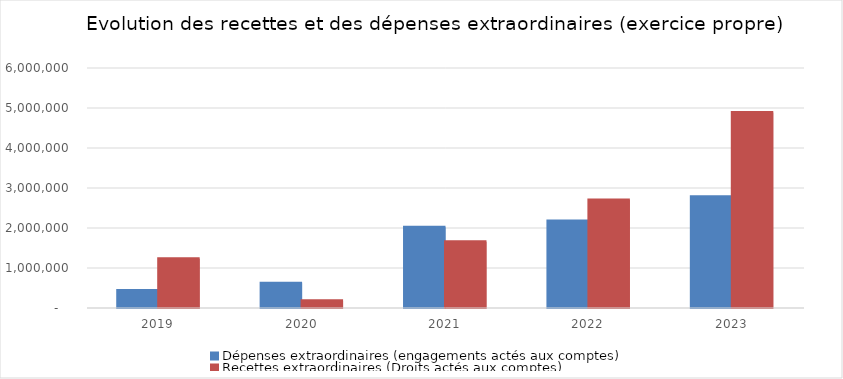
| Category | Dépenses extraordinaires (engagements actés aux comptes) | Recettes extraordinaires (Droits actés aux comptes) |
|---|---|---|
| 2019.0 | 435444.52 | 1230542.5 |
| 2020.0 | 619448.47 | 178625.62 |
| 2021.0 | 2021416.13 | 1657499.78 |
| 2022.0 | 2177705.07 | 2698770.94 |
| 2023.0 | 2781070.86 | 4885367.23 |